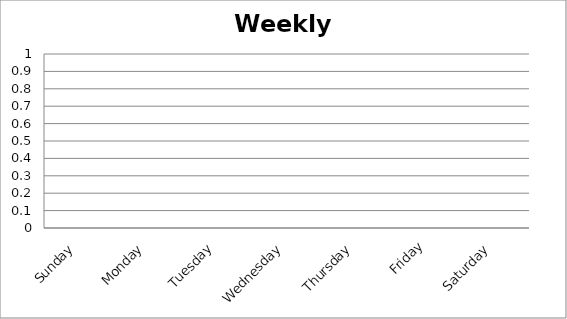
| Category | Series 0 |
|---|---|
| Sunday | 0 |
| Monday | 0 |
| Tuesday | 0 |
| Wednesday | 0 |
| Thursday | 0 |
| Friday | 0 |
| Saturday | 0 |